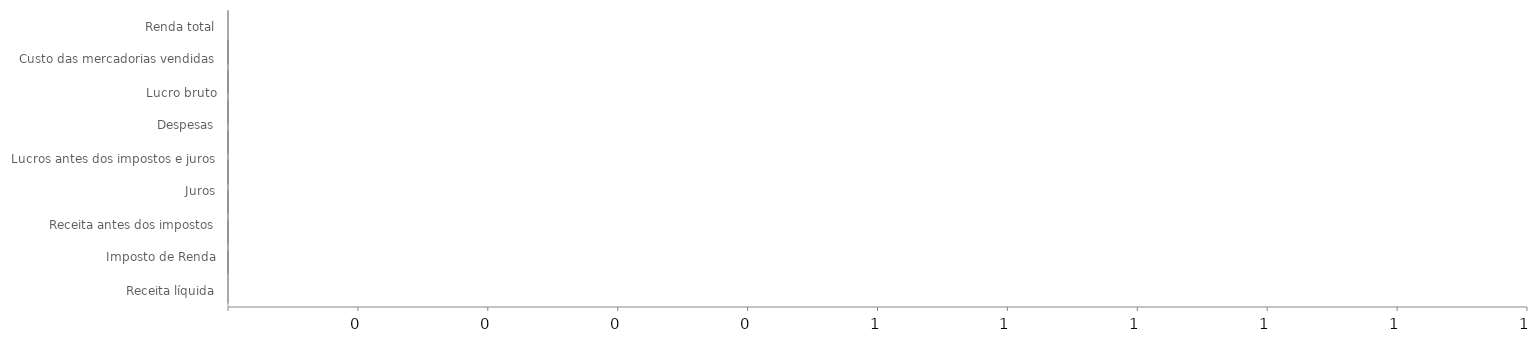
| Category | Final | Em branco | PerdaNeg | GanhoNeg | PerdaPos | GanhoPos |
|---|---|---|---|---|---|---|
| Renda total | 0 | 0 | 0 | 0 | 0 | 0 |
| Custo das mercadorias vendidas | 0 | 0 | 0 | 0 | 0 | 0 |
| Lucro bruto | 0 | 0 | 0 | 0 | 0 | 0 |
| Despesas | 0 | 0 | 0 | 0 | 0 | 0 |
| Lucros antes dos impostos e juros | 0 | 0 | 0 | 0 | 0 | 0 |
| Juros | 0 | 0 | 0 | 0 | 0 | 0 |
| Receita antes dos impostos | 0 | 0 | 0 | 0 | 0 | 0 |
| Imposto de Renda | 0 | 0 | 0 | 0 | 0 | 0 |
| Receita líquida | 0 | 0 | 0 | 0 | 0 | 0 |